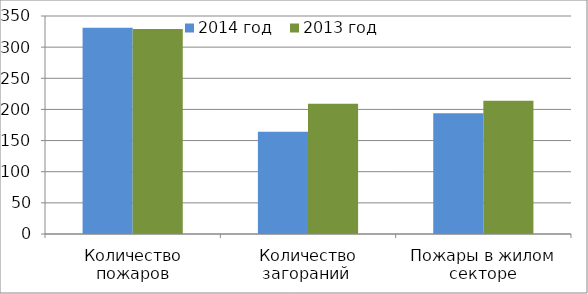
| Category | 2014 год | 2013 год |
|---|---|---|
| Количество пожаров | 331 | 329 |
| Количество загораний  | 164 | 209 |
| Пожары в жилом секторе | 194 | 214 |